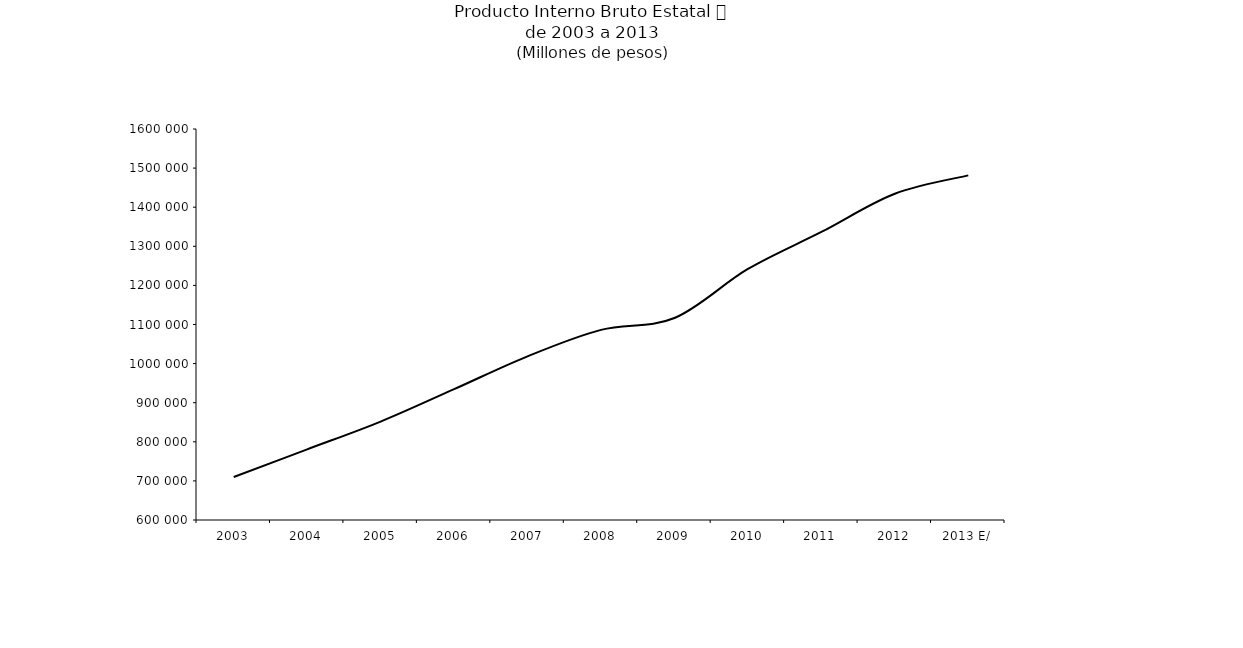
| Category | Producto Interno Bruto a precios de mercado E/ |
|---|---|
| 2003 | 710104.612 |
| 2004 | 780722.71 |
| 2005 | 851717.554 |
| 2006 | 934557.715 |
| 2007 | 1018593.628 |
| 2008 | 1086260.887 |
| 2009 | 1116549.676 |
| 2010 | 1241995.953 |
| 2011 | 1336660.628 |
| 2012 | 1434472.269 |
| 2013 E/ | 1481405.702 |